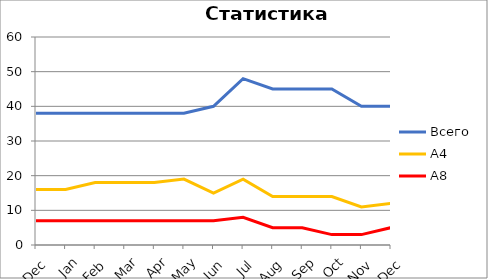
| Category | Всего | А4 | A8 |
|---|---|---|---|
| 0 | 38 | 16 | 7 |
| 1 | 38 | 16 | 7 |
| 2 | 38 | 18 | 7 |
| 3 | 38 | 18 | 7 |
| 4 | 38 | 18 | 7 |
| 5 | 38 | 19 | 7 |
| 6 | 40 | 15 | 7 |
| 7 | 48 | 19 | 8 |
| 8 | 45 | 14 | 5 |
| 9 | 45 | 14 | 5 |
| 10 | 45 | 14 | 3 |
| 11 | 40 | 11 | 3 |
| 12 | 40 | 12 | 5 |